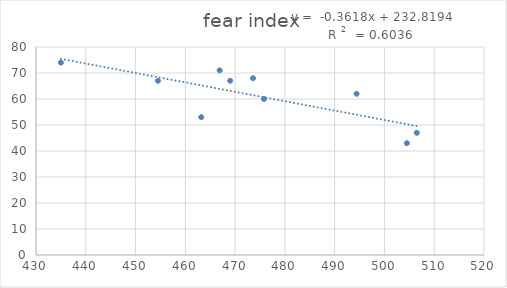
| Category | fear index |
|---|---|
| 506.5 | 47 |
| 504.5 | 43 |
| 494.4 | 62 |
| 475.8 | 60 |
| 463.2 | 53 |
| 469.0 | 67 |
| 473.6 | 68 |
| 466.9 | 71 |
| 454.5 | 67 |
| 435.0 | 74 |